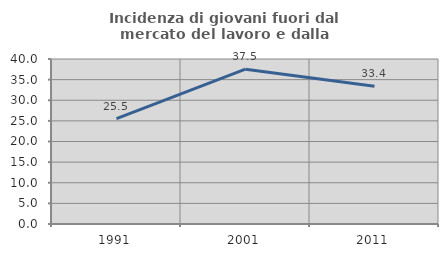
| Category | Incidenza di giovani fuori dal mercato del lavoro e dalla formazione  |
|---|---|
| 1991.0 | 25.529 |
| 2001.0 | 37.524 |
| 2011.0 | 33.411 |